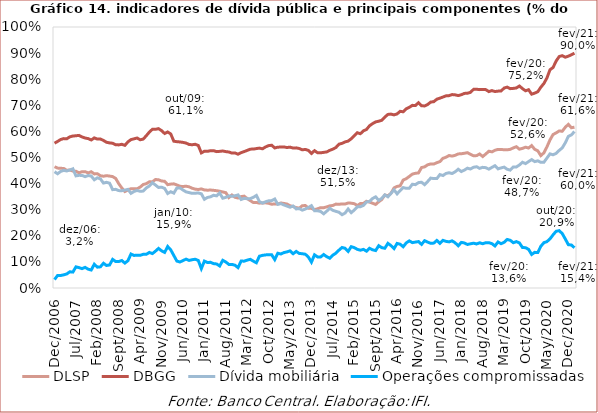
| Category | DLSP | DBGG | Dívida mobiliária | Operações compromissadas |
|---|---|---|---|---|
| 2006-12-01 | 0.465 | 0.555 | 0.446 | 0.032 |
| 2007-01-01 | 0.459 | 0.562 | 0.438 | 0.048 |
| 2007-02-01 | 0.459 | 0.569 | 0.446 | 0.048 |
| 2007-03-01 | 0.458 | 0.572 | 0.451 | 0.05 |
| 2007-04-01 | 0.451 | 0.572 | 0.448 | 0.054 |
| 2007-05-01 | 0.452 | 0.579 | 0.452 | 0.062 |
| 2007-06-01 | 0.448 | 0.582 | 0.457 | 0.061 |
| 2007-07-01 | 0.447 | 0.583 | 0.43 | 0.081 |
| 2007-08-01 | 0.441 | 0.585 | 0.432 | 0.078 |
| 2007-09-01 | 0.446 | 0.579 | 0.431 | 0.074 |
| 2007-10-01 | 0.446 | 0.575 | 0.427 | 0.079 |
| 2007-11-01 | 0.441 | 0.572 | 0.431 | 0.072 |
| 2007-12-01 | 0.445 | 0.567 | 0.429 | 0.069 |
| 2008-01-01 | 0.437 | 0.575 | 0.415 | 0.091 |
| 2008-02-01 | 0.438 | 0.57 | 0.422 | 0.08 |
| 2008-03-01 | 0.43 | 0.571 | 0.418 | 0.081 |
| 2008-04-01 | 0.428 | 0.565 | 0.402 | 0.095 |
| 2008-05-01 | 0.43 | 0.558 | 0.405 | 0.086 |
| 2008-06-01 | 0.429 | 0.556 | 0.402 | 0.088 |
| 2008-07-01 | 0.427 | 0.555 | 0.377 | 0.11 |
| 2008-08-01 | 0.42 | 0.549 | 0.378 | 0.101 |
| 2008-09-01 | 0.4 | 0.548 | 0.373 | 0.101 |
| 2008-10-01 | 0.383 | 0.551 | 0.373 | 0.105 |
| 2008-11-01 | 0.37 | 0.547 | 0.375 | 0.095 |
| 2008-12-01 | 0.376 | 0.56 | 0.378 | 0.105 |
| 2009-01-01 | 0.38 | 0.569 | 0.363 | 0.13 |
| 2009-02-01 | 0.38 | 0.572 | 0.37 | 0.125 |
| 2009-03-01 | 0.38 | 0.575 | 0.374 | 0.126 |
| 2009-04-01 | 0.386 | 0.568 | 0.37 | 0.125 |
| 2009-05-01 | 0.397 | 0.571 | 0.371 | 0.129 |
| 2009-06-01 | 0.4 | 0.583 | 0.383 | 0.129 |
| 2009-07-01 | 0.407 | 0.597 | 0.391 | 0.136 |
| 2009-08-01 | 0.407 | 0.608 | 0.403 | 0.132 |
| 2009-09-01 | 0.416 | 0.608 | 0.394 | 0.141 |
| 2009-10-01 | 0.415 | 0.611 | 0.385 | 0.152 |
| 2009-11-01 | 0.41 | 0.603 | 0.386 | 0.143 |
| 2009-12-01 | 0.409 | 0.592 | 0.382 | 0.136 |
| 2010-01-01 | 0.396 | 0.598 | 0.362 | 0.159 |
| 2010-02-01 | 0.398 | 0.59 | 0.369 | 0.146 |
| 2010-03-01 | 0.399 | 0.562 | 0.364 | 0.125 |
| 2010-04-01 | 0.395 | 0.561 | 0.383 | 0.103 |
| 2010-05-01 | 0.39 | 0.56 | 0.384 | 0.1 |
| 2010-06-01 | 0.389 | 0.558 | 0.376 | 0.105 |
| 2010-07-01 | 0.39 | 0.555 | 0.368 | 0.111 |
| 2010-08-01 | 0.388 | 0.55 | 0.366 | 0.106 |
| 2010-09-01 | 0.382 | 0.549 | 0.363 | 0.108 |
| 2010-10-01 | 0.379 | 0.551 | 0.363 | 0.11 |
| 2010-11-01 | 0.377 | 0.546 | 0.364 | 0.106 |
| 2010-12-01 | 0.38 | 0.518 | 0.361 | 0.074 |
| 2011-01-01 | 0.376 | 0.524 | 0.34 | 0.103 |
| 2011-02-01 | 0.375 | 0.524 | 0.347 | 0.098 |
| 2011-03-01 | 0.375 | 0.526 | 0.35 | 0.098 |
| 2011-04-01 | 0.374 | 0.526 | 0.355 | 0.093 |
| 2011-05-01 | 0.373 | 0.523 | 0.353 | 0.092 |
| 2011-06-01 | 0.371 | 0.524 | 0.364 | 0.084 |
| 2011-07-01 | 0.368 | 0.525 | 0.344 | 0.106 |
| 2011-08-01 | 0.365 | 0.523 | 0.347 | 0.1 |
| 2011-09-01 | 0.347 | 0.521 | 0.353 | 0.09 |
| 2011-10-01 | 0.356 | 0.517 | 0.352 | 0.09 |
| 2011-11-01 | 0.348 | 0.517 | 0.353 | 0.087 |
| 2011-12-01 | 0.345 | 0.513 | 0.357 | 0.078 |
| 2012-01-01 | 0.35 | 0.519 | 0.339 | 0.103 |
| 2012-02-01 | 0.352 | 0.523 | 0.343 | 0.103 |
| 2012-03-01 | 0.343 | 0.527 | 0.342 | 0.107 |
| 2012-04-01 | 0.335 | 0.532 | 0.342 | 0.11 |
| 2012-05-01 | 0.327 | 0.532 | 0.347 | 0.103 |
| 2012-06-01 | 0.328 | 0.534 | 0.355 | 0.097 |
| 2012-07-01 | 0.325 | 0.536 | 0.331 | 0.122 |
| 2012-08-01 | 0.326 | 0.533 | 0.325 | 0.125 |
| 2012-09-01 | 0.326 | 0.54 | 0.33 | 0.127 |
| 2012-10-01 | 0.325 | 0.546 | 0.334 | 0.128 |
| 2012-11-01 | 0.321 | 0.547 | 0.335 | 0.127 |
| 2012-12-01 | 0.322 | 0.537 | 0.341 | 0.109 |
| 2013-01-01 | 0.322 | 0.54 | 0.321 | 0.133 |
| 2013-02-01 | 0.326 | 0.54 | 0.323 | 0.13 |
| 2013-03-01 | 0.324 | 0.541 | 0.318 | 0.136 |
| 2013-04-01 | 0.322 | 0.538 | 0.314 | 0.138 |
| 2013-05-01 | 0.315 | 0.54 | 0.309 | 0.142 |
| 2013-06-01 | 0.312 | 0.536 | 0.314 | 0.131 |
| 2013-07-01 | 0.308 | 0.537 | 0.303 | 0.14 |
| 2013-08-01 | 0.306 | 0.534 | 0.304 | 0.133 |
| 2013-09-01 | 0.315 | 0.529 | 0.298 | 0.131 |
| 2013-10-01 | 0.316 | 0.531 | 0.303 | 0.129 |
| 2013-11-01 | 0.306 | 0.527 | 0.308 | 0.118 |
| 2013-12-01 | 0.305 | 0.515 | 0.315 | 0.099 |
| 2014-01-01 | 0.3 | 0.526 | 0.296 | 0.127 |
| 2014-02-01 | 0.304 | 0.518 | 0.296 | 0.119 |
| 2014-03-01 | 0.308 | 0.518 | 0.293 | 0.119 |
| 2014-04-01 | 0.308 | 0.52 | 0.284 | 0.128 |
| 2014-05-01 | 0.311 | 0.521 | 0.294 | 0.12 |
| 2014-06-01 | 0.315 | 0.527 | 0.305 | 0.114 |
| 2014-07-01 | 0.316 | 0.532 | 0.298 | 0.126 |
| 2014-08-01 | 0.321 | 0.538 | 0.294 | 0.133 |
| 2014-09-01 | 0.321 | 0.551 | 0.29 | 0.145 |
| 2014-10-01 | 0.322 | 0.554 | 0.281 | 0.155 |
| 2014-11-01 | 0.322 | 0.56 | 0.287 | 0.152 |
| 2014-12-01 | 0.326 | 0.563 | 0.303 | 0.14 |
| 2015-01-01 | 0.325 | 0.572 | 0.289 | 0.158 |
| 2015-02-01 | 0.323 | 0.583 | 0.299 | 0.155 |
| 2015-03-01 | 0.316 | 0.595 | 0.311 | 0.148 |
| 2015-04-01 | 0.323 | 0.591 | 0.311 | 0.145 |
| 2015-05-01 | 0.324 | 0.602 | 0.316 | 0.148 |
| 2015-06-01 | 0.332 | 0.607 | 0.33 | 0.141 |
| 2015-07-01 | 0.329 | 0.622 | 0.332 | 0.152 |
| 2015-08-01 | 0.325 | 0.63 | 0.343 | 0.146 |
| 2015-09-01 | 0.32 | 0.636 | 0.349 | 0.144 |
| 2015-10-01 | 0.33 | 0.639 | 0.336 | 0.162 |
| 2015-11-01 | 0.339 | 0.643 | 0.343 | 0.155 |
| 2015-12-01 | 0.356 | 0.655 | 0.357 | 0.152 |
| 2016-01-01 | 0.353 | 0.665 | 0.349 | 0.171 |
| 2016-02-01 | 0.363 | 0.666 | 0.362 | 0.162 |
| 2016-03-01 | 0.383 | 0.663 | 0.376 | 0.151 |
| 2016-04-01 | 0.389 | 0.667 | 0.361 | 0.171 |
| 2016-05-01 | 0.391 | 0.677 | 0.373 | 0.168 |
| 2016-06-01 | 0.413 | 0.675 | 0.385 | 0.158 |
| 2016-07-01 | 0.419 | 0.686 | 0.382 | 0.173 |
| 2016-08-01 | 0.427 | 0.692 | 0.382 | 0.18 |
| 2016-09-01 | 0.436 | 0.7 | 0.398 | 0.174 |
| 2016-10-01 | 0.44 | 0.699 | 0.396 | 0.176 |
| 2016-11-01 | 0.441 | 0.71 | 0.404 | 0.178 |
| 2016-12-01 | 0.461 | 0.698 | 0.405 | 0.167 |
| 2017-01-01 | 0.464 | 0.697 | 0.396 | 0.181 |
| 2017-02-01 | 0.472 | 0.703 | 0.408 | 0.176 |
| 2017-03-01 | 0.475 | 0.712 | 0.421 | 0.171 |
| 2017-04-01 | 0.475 | 0.714 | 0.419 | 0.172 |
| 2017-05-01 | 0.48 | 0.723 | 0.419 | 0.182 |
| 2017-06-01 | 0.484 | 0.727 | 0.435 | 0.171 |
| 2017-07-01 | 0.497 | 0.732 | 0.431 | 0.183 |
| 2017-08-01 | 0.501 | 0.736 | 0.439 | 0.179 |
| 2017-09-01 | 0.508 | 0.737 | 0.442 | 0.177 |
| 2017-10-01 | 0.505 | 0.741 | 0.439 | 0.181 |
| 2017-11-01 | 0.508 | 0.74 | 0.445 | 0.173 |
| 2017-12-01 | 0.514 | 0.737 | 0.455 | 0.162 |
| 2018-01-01 | 0.514 | 0.741 | 0.446 | 0.175 |
| 2018-02-01 | 0.516 | 0.746 | 0.452 | 0.173 |
| 2018-03-01 | 0.518 | 0.746 | 0.459 | 0.167 |
| 2018-04-01 | 0.512 | 0.75 | 0.456 | 0.169 |
| 2018-05-01 | 0.507 | 0.761 | 0.463 | 0.172 |
| 2018-06-01 | 0.507 | 0.762 | 0.464 | 0.169 |
| 2018-07-01 | 0.513 | 0.76 | 0.458 | 0.173 |
| 2018-08-01 | 0.504 | 0.761 | 0.462 | 0.17 |
| 2018-09-01 | 0.513 | 0.76 | 0.461 | 0.174 |
| 2018-10-01 | 0.524 | 0.753 | 0.455 | 0.174 |
| 2018-11-01 | 0.522 | 0.756 | 0.462 | 0.17 |
| 2018-12-01 | 0.528 | 0.753 | 0.469 | 0.161 |
| 2019-01-01 | 0.531 | 0.754 | 0.456 | 0.176 |
| 2019-02-01 | 0.531 | 0.755 | 0.46 | 0.17 |
| 2019-03-01 | 0.53 | 0.766 | 0.463 | 0.175 |
| 2019-04-01 | 0.53 | 0.77 | 0.455 | 0.186 |
| 2019-05-01 | 0.531 | 0.764 | 0.452 | 0.183 |
| 2019-06-01 | 0.537 | 0.765 | 0.464 | 0.173 |
| 2019-07-01 | 0.541 | 0.766 | 0.464 | 0.178 |
| 2019-08-01 | 0.532 | 0.774 | 0.471 | 0.173 |
| 2019-09-01 | 0.535 | 0.764 | 0.482 | 0.155 |
| 2019-10-01 | 0.54 | 0.756 | 0.477 | 0.155 |
| 2019-11-01 | 0.536 | 0.76 | 0.484 | 0.148 |
| 2019-12-01 | 0.546 | 0.743 | 0.492 | 0.128 |
| 2020-01-01 | 0.531 | 0.747 | 0.484 | 0.137 |
| 2020-02-01 | 0.526 | 0.752 | 0.487 | 0.136 |
| 2020-03-01 | 0.507 | 0.769 | 0.481 | 0.16 |
| 2020-04-01 | 0.518 | 0.784 | 0.482 | 0.174 |
| 2020-05-01 | 0.541 | 0.805 | 0.498 | 0.178 |
| 2020-06-01 | 0.567 | 0.836 | 0.514 | 0.188 |
| 2020-07-01 | 0.588 | 0.845 | 0.51 | 0.204 |
| 2020-08-01 | 0.594 | 0.869 | 0.516 | 0.217 |
| 2020-09-01 | 0.602 | 0.887 | 0.527 | 0.22 |
| 2020-10-01 | 0.601 | 0.89 | 0.537 | 0.209 |
| 2020-11-01 | 0.616 | 0.884 | 0.556 | 0.188 |
| 2020-12-01 | 0.627 | 0.888 | 0.581 | 0.166 |
| 2021-01-01 | 0.614 | 0.894 | 0.587 | 0.165 |
| 2021-02-01 | 0.616 | 0.9 | 0.6 | 0.154 |